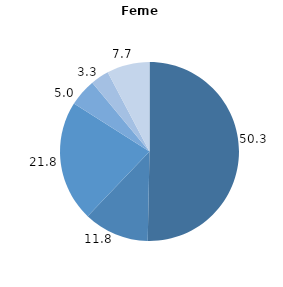
| Category | Series 0 |
|---|---|
| 0 | 50.314 |
| 1 | 11.829 |
| 2 | 21.85 |
| 3 | 4.97 |
| 4 | 3.305 |
| 5 | 7.732 |